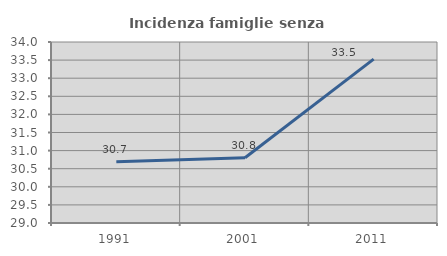
| Category | Incidenza famiglie senza nuclei |
|---|---|
| 1991.0 | 30.693 |
| 2001.0 | 30.802 |
| 2011.0 | 33.527 |